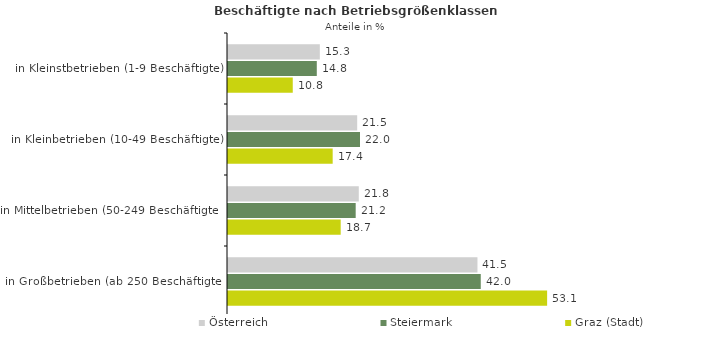
| Category | Österreich | Steiermark | Graz (Stadt) |
|---|---|---|---|
| in Kleinstbetrieben (1-9 Beschäftigte) | 15.273 | 14.768 | 10.771 |
| in Kleinbetrieben (10-49 Beschäftigte) | 21.487 | 21.955 | 17.41 |
| in Mittelbetrieben (50-249 Beschäftigte) | 21.75 | 21.237 | 18.743 |
| in Großbetrieben (ab 250 Beschäftigte) | 41.489 | 42.04 | 53.076 |